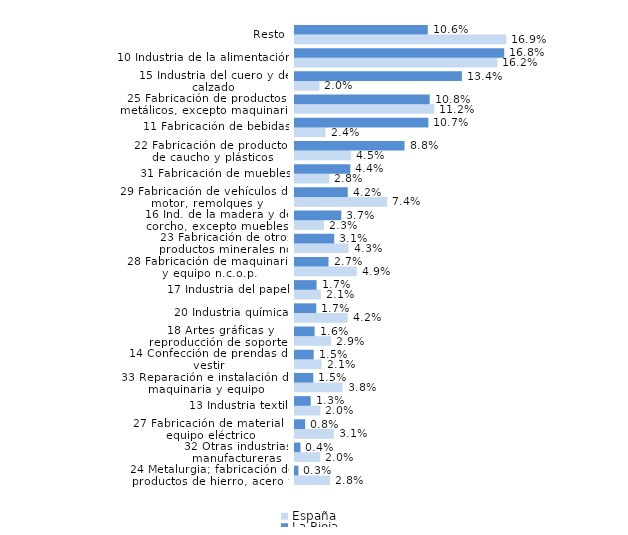
| Category | España | La Rioja |
|---|---|---|
| 24 Metalurgia; fabricación de productos de hierro, acero y ferroaleaciones | 0.028 | 0.003 |
| 32 Otras industrias manufactureras | 0.02 | 0.004 |
| 27 Fabricación de material y equipo eléctrico | 0.031 | 0.008 |
| 13 Industria textil | 0.02 | 0.013 |
| 33 Reparación e instalación de maquinaria y equipo | 0.038 | 0.015 |
| 14 Confección de prendas de vestir | 0.021 | 0.015 |
| 18 Artes gráficas y reproducción de soportes grabados | 0.029 | 0.016 |
| 20 Industria química | 0.042 | 0.017 |
| 17 Industria del papel | 0.021 | 0.017 |
| 28 Fabricación de maquinaria y equipo n.c.o.p. | 0.049 | 0.027 |
| 23 Fabricación de otros productos minerales no metálicos | 0.043 | 0.031 |
| 16 Ind. de la madera y del corcho, excepto muebles; cestería y espartería | 0.023 | 0.037 |
| 29 Fabricación de vehículos de motor, remolques y semirremolques | 0.074 | 0.042 |
| 31 Fabricación de muebles | 0.028 | 0.044 |
| 22 Fabricación de productos de caucho y plásticos | 0.045 | 0.088 |
| 11 Fabricación de bebidas | 0.024 | 0.107 |
| 25 Fabricación de productos metálicos, excepto maquinaria y equipo | 0.112 | 0.108 |
| 15 Industria del cuero y del calzado | 0.02 | 0.134 |
| 10 Industria de la alimentación | 0.162 | 0.168 |
| Resto | 0.169 | 0.106 |